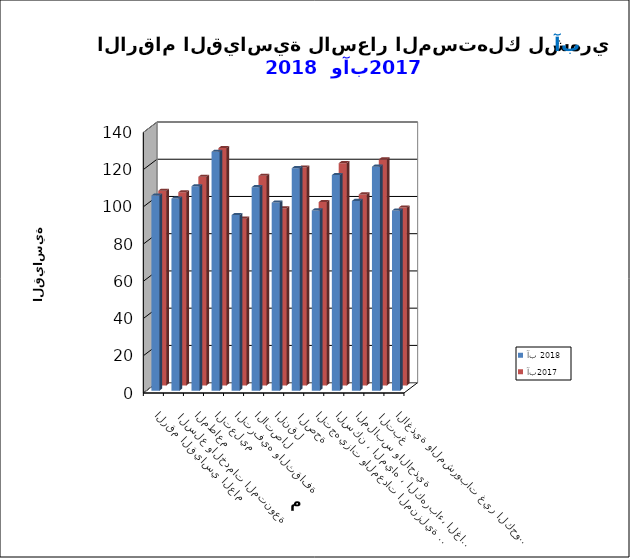
| Category | آب 2018      | آب2017 |
|---|---|---|
| الاغذية والمشروبات غير الكحولية | 96.7 | 95.6 |
|  التبغ | 120.3 | 121.4 |
| الملابس والاحذية | 101.9 | 102.6 |
| السكن ، المياه ، الكهرباء، الغاز  | 115.8 | 119.4 |
| التجهيزات والمعدات المنزلية والصيانة | 96.8 | 98.5 |
|  الصحة | 119.5 | 117.1 |
| النقل | 101 | 95.1 |
| الاتصال | 109.3 | 112.6 |
| الترفيه والثقافة | 94.3 | 89.6 |
| التعليم | 128.3 | 127.5 |
| المطاعم  | 109.8 | 112.1 |
|  السلع والخدمات المتنوعة | 103.2 | 103.8 |
| الرقم القياسي العام | 104.8 | 104.6 |